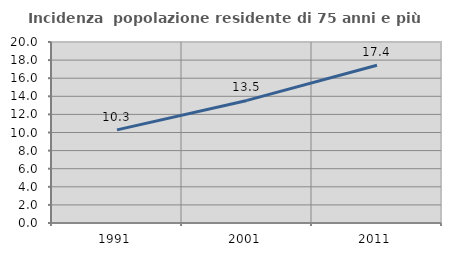
| Category | Incidenza  popolazione residente di 75 anni e più |
|---|---|
| 1991.0 | 10.291 |
| 2001.0 | 13.545 |
| 2011.0 | 17.427 |